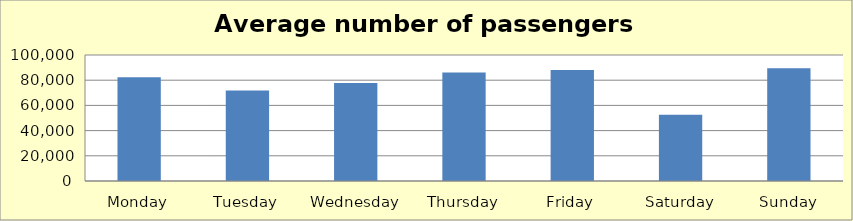
| Category | Average number of passengers 2019 |
|---|---|
| Monday | 82326.942 |
| Tuesday | 71834.623 |
| Wednesday | 77770.615 |
| Thursday | 86093.25 |
| Friday | 88076.635 |
| Saturday | 52483.596 |
| Sunday | 89495.596 |